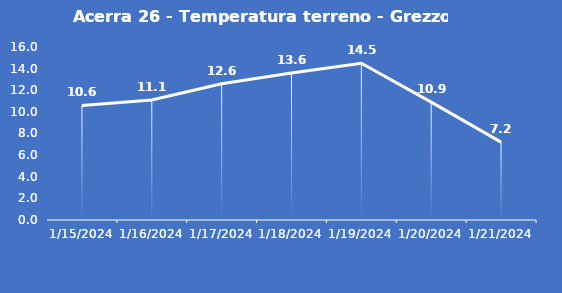
| Category | Acerra 26 - Temperatura terreno - Grezzo (°C) |
|---|---|
| 1/15/24 | 10.6 |
| 1/16/24 | 11.1 |
| 1/17/24 | 12.6 |
| 1/18/24 | 13.6 |
| 1/19/24 | 14.5 |
| 1/20/24 | 10.9 |
| 1/21/24 | 7.2 |